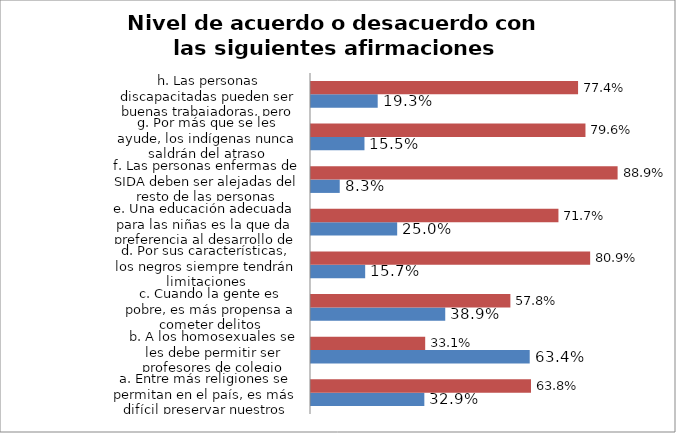
| Category | Acuerdo | Desacuerdo |
|---|---|---|
| a. Entre más religiones se permitan en el país, es más difícil preservar nuestros valores | 0.329 | 0.638 |
| b. A los homosexuales se les debe permitir ser profesores de colegio | 0.634 | 0.331 |
| c. Cuando la gente es pobre, es más propensa a cometer delitos | 0.389 | 0.578 |
| d. Por sus características, los negros siempre tendrán limitaciones | 0.157 | 0.809 |
| e. Una educación adecuada para las niñas es la que da preferencia al desarrollo de sus roles de madre y esposa | 0.25 | 0.717 |
| f. Las personas enfermas de SIDA deben ser alejadas del resto de las personas | 0.083 | 0.889 |
| g. Por más que se les ayude, los indígenas nunca saldrán del atraso | 0.155 | 0.796 |
| h. Las personas discapacitadas pueden ser buenas trabajadoras, pero no en niveles directivos | 0.193 | 0.774 |